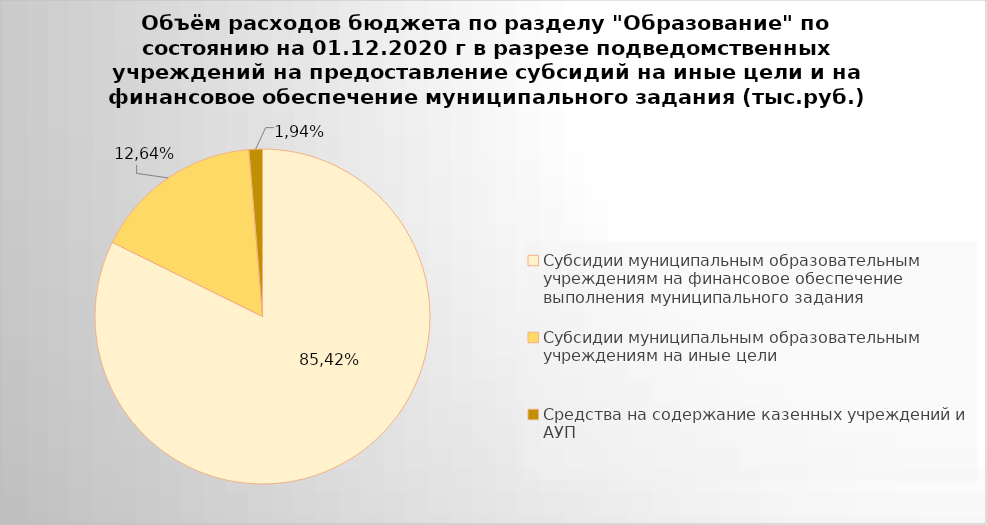
| Category | Series 0 |
|---|---|
| Субсидии муниципальным образовательным учреждениям на финансовое обеспечение выполнения муниципального задания | 5455160.39 |
| Субсидии муниципальным образовательным учреждениям на иные цели | 1087261.8 |
| Средства на содержание казенных учреждений и АУП | 86268.58 |